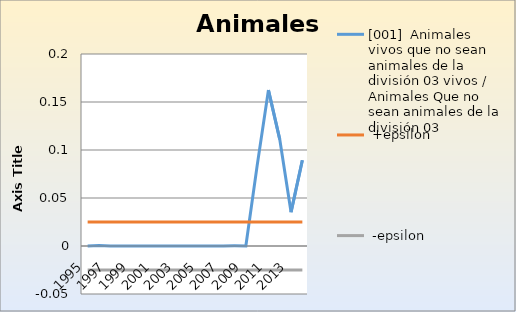
| Category | [001]  Animales vivos que no sean animales de la división 03 vivos / Animales Que no sean animales de la división 03 |  +epsilon |  -epsilon |
|---|---|---|---|
| 1995.0 | 0 | 0.025 | -0.025 |
| 1996.0 | 0 | 0.025 | -0.025 |
| 1997.0 | 0 | 0.025 | -0.025 |
| 1998.0 | 0 | 0.025 | -0.025 |
| 1999.0 | 0 | 0.025 | -0.025 |
| 2000.0 | 0 | 0.025 | -0.025 |
| 2001.0 | 0 | 0.025 | -0.025 |
| 2002.0 | 0 | 0.025 | -0.025 |
| 2003.0 | 0 | 0.025 | -0.025 |
| 2004.0 | 0 | 0.025 | -0.025 |
| 2005.0 | 0 | 0.025 | -0.025 |
| 2006.0 | 0 | 0.025 | -0.025 |
| 2007.0 | 0 | 0.025 | -0.025 |
| 2008.0 | 0 | 0.025 | -0.025 |
| 2009.0 | 0 | 0.025 | -0.025 |
| 2010.0 | 0.084 | 0.025 | -0.025 |
| 2011.0 | 0.162 | 0.025 | -0.025 |
| 2012.0 | 0.111 | 0.025 | -0.025 |
| 2013.0 | 0.035 | 0.025 | -0.025 |
| 2014.0 | 0.089 | 0.025 | -0.025 |